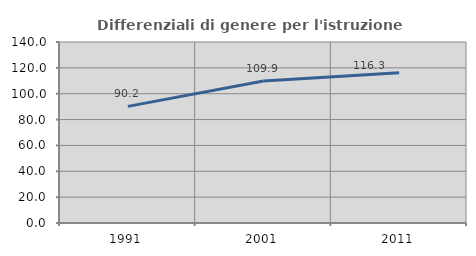
| Category | Differenziali di genere per l'istruzione superiore |
|---|---|
| 1991.0 | 90.189 |
| 2001.0 | 109.905 |
| 2011.0 | 116.296 |